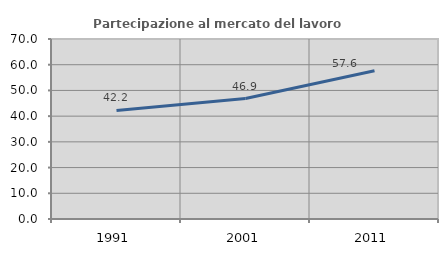
| Category | Partecipazione al mercato del lavoro  femminile |
|---|---|
| 1991.0 | 42.196 |
| 2001.0 | 46.857 |
| 2011.0 | 57.648 |